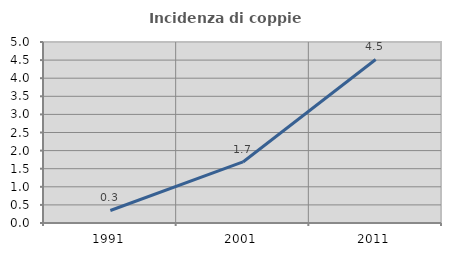
| Category | Incidenza di coppie miste |
|---|---|
| 1991.0 | 0.346 |
| 2001.0 | 1.687 |
| 2011.0 | 4.518 |